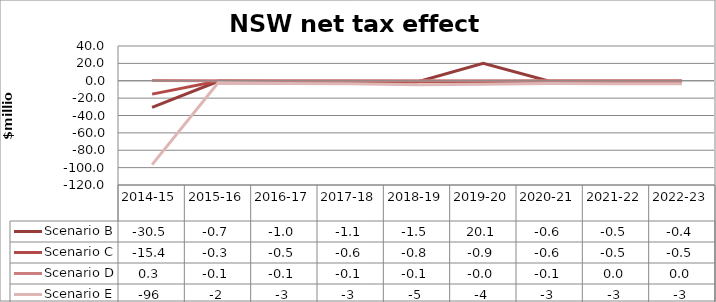
| Category | Scenario B | Scenario C | Scenario D | Scenario E |
|---|---|---|---|---|
| 2014-15 | -30.529 | -15.395 | 0.312 | -96.492 |
| 2015-16 | -0.651 | -0.323 | -0.11 | -2.145 |
| 2016-17 | -0.995 | -0.522 | -0.097 | -3.117 |
| 2017-18 | -1.142 | -0.619 | -0.055 | -3.47 |
| 2018-19 | -1.474 | -0.787 | -0.059 | -4.537 |
| 2019-20 | 20.095 | -0.86 | -0.035 | -4.078 |
| 2020-21 | -0.65 | -0.571 | -0.073 | -3.288 |
| 2021-22 | -0.51 | -0.54 | 0.023 | -3.385 |
| 2022-23 | -0.441 | -0.522 | 0.043 | -3.399 |